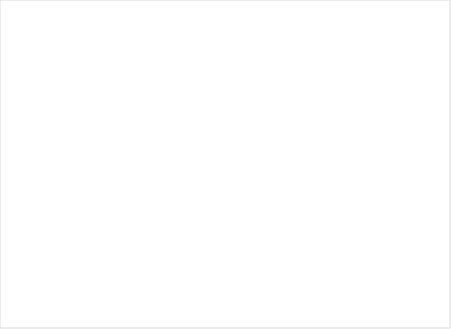
| Category | Total |
|---|---|
| Ja, af og til | 1 |